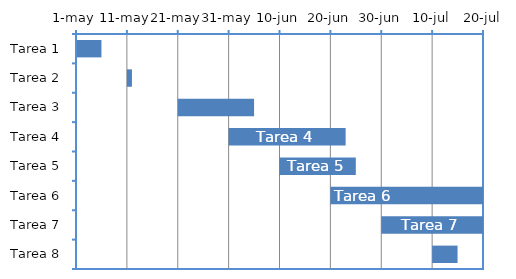
| Category | Fecha de inicio | Duración  |
|---|---|---|
| Tarea 1 | 01/05/2007 | 5 |
| Tarea 2 | 11/05/2007 | 1 |
| Tarea 3 | 21/05/2007 | 15 |
| Tarea 4 | 31/05/2007 | 23 |
| Tarea 5 | 10/06/2007 | 15 |
| Tarea 6 | 20/06/2007 | 48 |
| Tarea 7 | 30/06/2007 | 20 |
| Tarea 8 | 10/07/2007 | 5 |